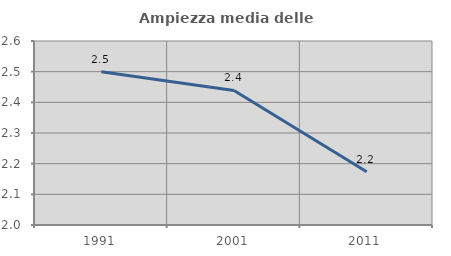
| Category | Ampiezza media delle famiglie |
|---|---|
| 1991.0 | 2.5 |
| 2001.0 | 2.439 |
| 2011.0 | 2.174 |